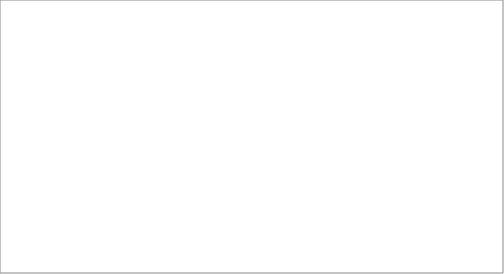
| Category | Series 0 |
|---|---|
| Car | 0.833 |
| Taxi | 0.025 |
| Bus / Coach | 0.029 |
| Van / Goods to 3.5t mgw | 0.059 |
| Goods vehicle over 3.5t | 0.018 |
| Motorcylce / Moped | 0.008 |
| Other motor vehicle | 0.029 |